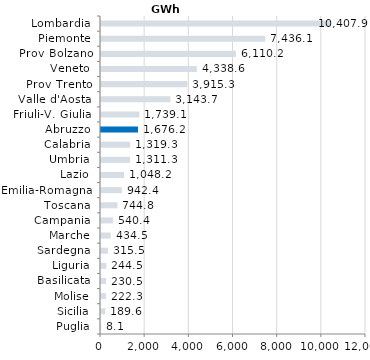
| Category | Series 0 |
|---|---|
| Puglia | 8.1 |
| Sicilia | 189.6 |
| Molise | 222.3 |
| Basilicata | 230.5 |
| Liguria | 244.5 |
| Sardegna | 315.5 |
| Marche | 434.5 |
| Campania | 540.4 |
| Toscana | 744.8 |
| Emilia-Romagna | 942.4 |
| Lazio | 1048.2 |
| Umbria | 1311.3 |
| Calabria | 1319.3 |
| Abruzzo | 1676.2 |
| Friuli-V. Giulia | 1739.1 |
| Valle d'Aosta | 3143.7 |
| Prov Trento | 3915.3 |
| Veneto | 4338.6 |
| Prov Bolzano | 6110.2 |
| Piemonte | 7436.1 |
| Lombardia | 10407.9 |